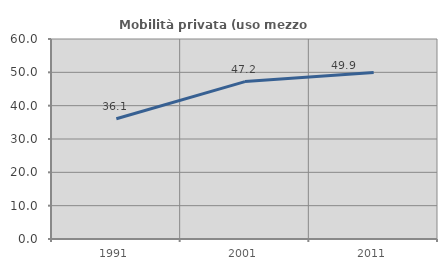
| Category | Mobilità privata (uso mezzo privato) |
|---|---|
| 1991.0 | 36.062 |
| 2001.0 | 47.226 |
| 2011.0 | 49.922 |